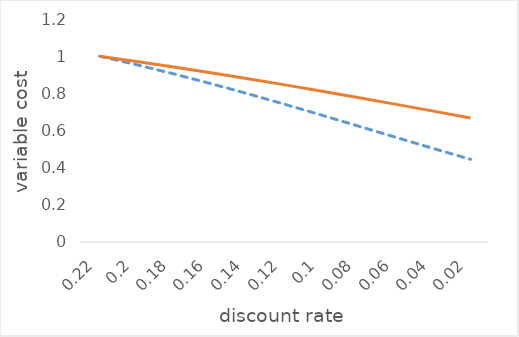
| Category | Series 0 | Series 1 | variable cost |
|---|---|---|---|
| 0.22 | 1 | 1 |  |
| 0.2 | 0.954 | 0.972 |  |
| 0.18 | 0.905 | 0.942 |  |
| 0.16 | 0.852 | 0.911 |  |
| 0.14 | 0.798 | 0.879 |  |
| 0.12 | 0.741 | 0.845 |  |
| 0.1 | 0.682 | 0.811 |  |
| 0.08 | 0.622 | 0.776 |  |
| 0.06 | 0.563 | 0.741 |  |
| 0.04 | 0.503 | 0.704 |  |
| 0.02 | 0.445 | 0.668 |  |